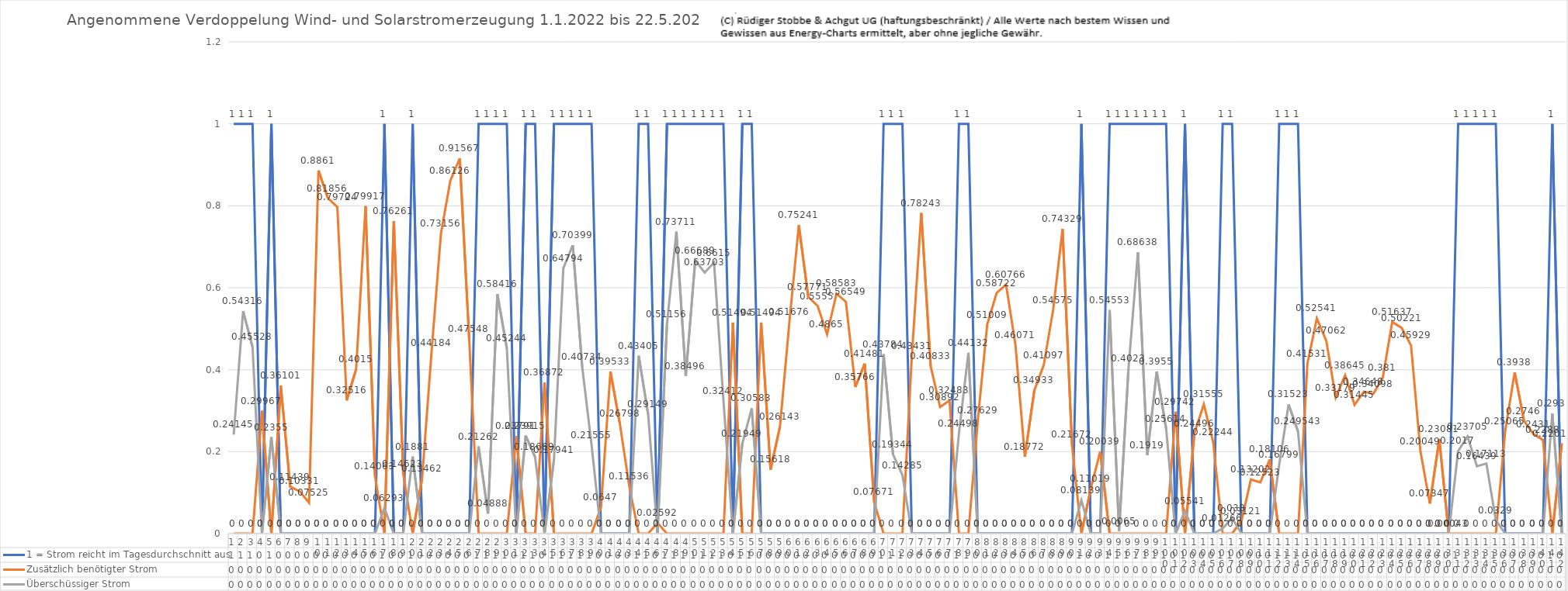
| Category | 1 = Strom reicht im Tagesdurchschnitt aus | Zusätzlich benötigter Strom | Überschüssiger Strom |
|---|---|---|---|
| 0 | 1 | 0 | 0.241 |
| 1 | 1 | 0 | 0.543 |
| 2 | 1 | 0 | 0.455 |
| 3 | 0 | 0.3 | 0 |
| 4 | 1 | 0 | 0.236 |
| 5 | 0 | 0.361 | 0 |
| 6 | 0 | 0.114 | 0 |
| 7 | 0 | 0.103 | 0 |
| 8 | 0 | 0.075 | 0 |
| 9 | 0 | 0.886 | 0 |
| 10 | 0 | 0.819 | 0 |
| 11 | 0 | 0.797 | 0 |
| 12 | 0 | 0.325 | 0 |
| 13 | 0 | 0.402 | 0 |
| 14 | 0 | 0.799 | 0 |
| 15 | 0 | 0.141 | 0 |
| 16 | 1 | 0 | 0.063 |
| 17 | 0 | 0.763 | 0 |
| 18 | 0 | 0.146 | 0 |
| 19 | 1 | 0 | 0.188 |
| 20 | 0 | 0.135 | 0 |
| 21 | 0 | 0.442 | 0 |
| 22 | 0 | 0.732 | 0 |
| 23 | 0 | 0.861 | 0 |
| 24 | 0 | 0.916 | 0 |
| 25 | 0 | 0.475 | 0 |
| 26 | 1 | 0 | 0.213 |
| 27 | 1 | 0 | 0.049 |
| 28 | 1 | 0 | 0.584 |
| 29 | 1 | 0 | 0.452 |
| 30 | 0 | 0.238 | 0 |
| 31 | 1 | 0 | 0.239 |
| 32 | 1 | 0 | 0.187 |
| 33 | 0 | 0.369 | 0 |
| 34 | 1 | 0 | 0.179 |
| 35 | 1 | 0 | 0.648 |
| 36 | 1 | 0 | 0.704 |
| 37 | 1 | 0 | 0.407 |
| 38 | 1 | 0 | 0.216 |
| 39 | 0 | 0.065 | 0 |
| 40 | 0 | 0.395 | 0 |
| 41 | 0 | 0.268 | 0 |
| 42 | 0 | 0.115 | 0 |
| 43 | 1 | 0 | 0.434 |
| 44 | 1 | 0 | 0.291 |
| 45 | 0 | 0.026 | 0 |
| 46 | 1 | 0 | 0.512 |
| 47 | 1 | 0 | 0.737 |
| 48 | 1 | 0 | 0.385 |
| 49 | 1 | 0 | 0.667 |
| 50 | 1 | 0 | 0.637 |
| 51 | 1 | 0 | 0.661 |
| 52 | 1 | 0 | 0.324 |
| 53 | 0 | 0.515 | 0 |
| 54 | 1 | 0 | 0.219 |
| 55 | 1 | 0 | 0.306 |
| 56 | 0 | 0.515 | 0 |
| 57 | 0 | 0.156 | 0 |
| 58 | 0 | 0.261 | 0 |
| 59 | 0 | 0.517 | 0 |
| 60 | 0 | 0.752 | 0 |
| 61 | 0 | 0.578 | 0 |
| 62 | 0 | 0.556 | 0 |
| 63 | 0 | 0.487 | 0 |
| 64 | 0 | 0.586 | 0 |
| 65 | 0 | 0.565 | 0 |
| 66 | 0 | 0.358 | 0 |
| 67 | 0 | 0.415 | 0 |
| 68 | 0 | 0.077 | 0 |
| 69 | 1 | 0 | 0.438 |
| 70 | 1 | 0 | 0.193 |
| 71 | 1 | 0 | 0.143 |
| 72 | 0 | 0.434 | 0 |
| 73 | 0 | 0.782 | 0 |
| 74 | 0 | 0.408 | 0 |
| 75 | 0 | 0.309 | 0 |
| 76 | 0 | 0.325 | 0 |
| 77 | 1 | 0 | 0.245 |
| 78 | 1 | 0 | 0.441 |
| 79 | 0 | 0.276 | 0 |
| 80 | 0 | 0.51 | 0 |
| 81 | 0 | 0.587 | 0 |
| 82 | 0 | 0.608 | 0 |
| 83 | 0 | 0.461 | 0 |
| 84 | 0 | 0.188 | 0 |
| 85 | 0 | 0.349 | 0 |
| 86 | 0 | 0.411 | 0 |
| 87 | 0 | 0.546 | 0 |
| 88 | 0 | 0.743 | 0 |
| 89 | 0 | 0.217 | 0 |
| 90 | 1 | 0 | 0.081 |
| 91 | 0 | 0.11 | 0 |
| 92 | 0 | 0.2 | 0 |
| 93 | 1 | 0 | 0.546 |
| 94 | 1 | 0 | 0.006 |
| 95 | 1 | 0 | 0.402 |
| 96 | 1 | 0 | 0.686 |
| 97 | 1 | 0 | 0.192 |
| 98 | 1 | 0 | 0.396 |
| 99 | 1 | 0 | 0.256 |
| 100 | 0 | 0.297 | 0 |
| 101 | 1 | 0 | 0.055 |
| 102 | 0 | 0.245 | 0 |
| 103 | 0 | 0.316 | 0 |
| 104 | 0 | 0.222 | 0 |
| 105 | 1 | 0 | 0.013 |
| 106 | 1 | 0 | 0.038 |
| 107 | 0 | 0.031 | 0 |
| 108 | 0 | 0.132 | 0 |
| 109 | 0 | 0.125 | 0 |
| 110 | 0 | 0.181 | 0 |
| 111 | 1 | 0 | 0.168 |
| 112 | 1 | 0 | 0.315 |
| 113 | 1 | 0 | 0.25 |
| 114 | 0 | 0.415 | 0 |
| 115 | 0 | 0.525 | 0 |
| 116 | 0 | 0.471 | 0 |
| 117 | 0 | 0.332 | 0 |
| 118 | 0 | 0.386 | 0 |
| 119 | 0 | 0.314 | 0 |
| 120 | 0 | 0.346 | 0 |
| 121 | 0 | 0.341 | 0 |
| 122 | 0 | 0.381 | 0 |
| 123 | 0 | 0.516 | 0 |
| 124 | 0 | 0.502 | 0 |
| 125 | 0 | 0.459 | 0 |
| 126 | 0 | 0.2 | 0 |
| 127 | 0 | 0.073 | 0 |
| 128 | 0 | 0.231 | 0 |
| 129 | 0 | 0 | 0 |
| 130 | 1 | 0 | 0.202 |
| 131 | 1 | 0 | 0.237 |
| 132 | 1 | 0 | 0.164 |
| 133 | 1 | 0 | 0.171 |
| 134 | 1 | 0 | 0.033 |
| 135 | 0 | 0.251 | 0 |
| 136 | 0 | 0.394 | 0 |
| 137 | 0 | 0.275 | 0 |
| 138 | 0 | 0.243 | 0 |
| 139 | 0 | 0.229 | 0 |
| 140 | 1 | 0 | 0.293 |
| 141 | 0 | 0.22 | 0 |